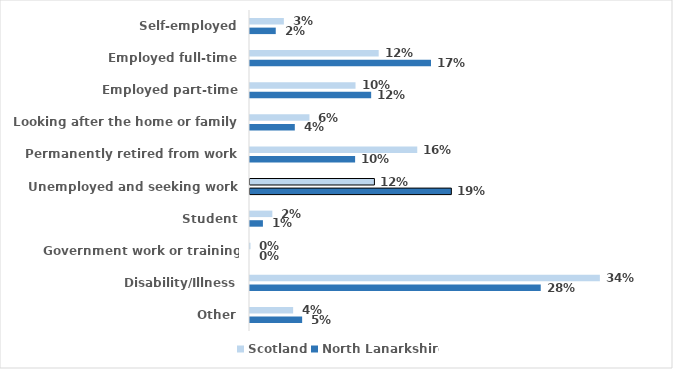
| Category | Scotland | North Lanarkshire |
|---|---|---|
| Self-employed | 0.033 | 0.025 |
| Employed full-time | 0.124 | 0.175 |
| Employed part-time | 0.102 | 0.117 |
| Looking after the home or family | 0.057 | 0.043 |
| Permanently retired from work | 0.162 | 0.102 |
| Unemployed and seeking work | 0.12 | 0.195 |
| Student | 0.022 | 0.012 |
| Government work or training scheme | 0 | 0 |
| Disability/Illness | 0.338 | 0.281 |
| Other | 0.042 | 0.05 |